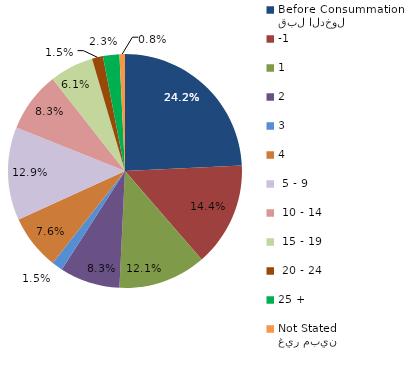
| Category | Series 0 |
|---|---|
| قبل الدخول
Before Consummation | 24.242 |
| -1 | 14.394 |
| 1 | 12.121 |
| 2 | 8.333 |
| 3 | 1.515 |
| 4 | 7.576 |
|  5 - 9 | 12.879 |
|  10 - 14 | 8.333 |
|  15 - 19 | 6.061 |
|  20 - 24 | 1.515 |
| 25 + | 2.273 |
| غير مبين
Not Stated | 0.758 |